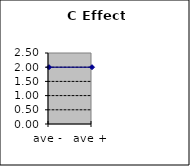
| Category | Series 0 |
|---|---|
| ave - | 2 |
| ave + | 2 |